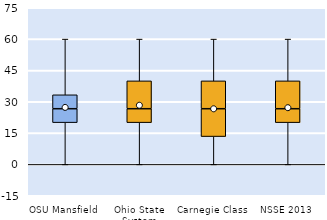
| Category | 25th | 50th | 75th |
|---|---|---|---|
| OSU Mansfield | 20 | 6.667 | 6.667 |
| Ohio State System | 20 | 6.667 | 13.333 |
| Carnegie Class | 13.333 | 13.333 | 13.333 |
| NSSE 2013 | 20 | 6.667 | 13.333 |